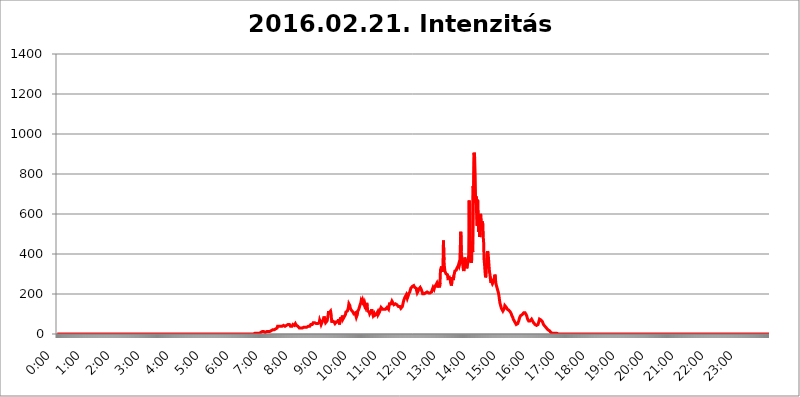
| Category | 2016.02.21. Intenzitás [W/m^2] |
|---|---|
| 0.0 | 0 |
| 0.0006944444444444445 | 0 |
| 0.001388888888888889 | 0 |
| 0.0020833333333333333 | 0 |
| 0.002777777777777778 | 0 |
| 0.003472222222222222 | 0 |
| 0.004166666666666667 | 0 |
| 0.004861111111111111 | 0 |
| 0.005555555555555556 | 0 |
| 0.0062499999999999995 | 0 |
| 0.006944444444444444 | 0 |
| 0.007638888888888889 | 0 |
| 0.008333333333333333 | 0 |
| 0.009027777777777779 | 0 |
| 0.009722222222222222 | 0 |
| 0.010416666666666666 | 0 |
| 0.011111111111111112 | 0 |
| 0.011805555555555555 | 0 |
| 0.012499999999999999 | 0 |
| 0.013194444444444444 | 0 |
| 0.013888888888888888 | 0 |
| 0.014583333333333332 | 0 |
| 0.015277777777777777 | 0 |
| 0.015972222222222224 | 0 |
| 0.016666666666666666 | 0 |
| 0.017361111111111112 | 0 |
| 0.018055555555555557 | 0 |
| 0.01875 | 0 |
| 0.019444444444444445 | 0 |
| 0.02013888888888889 | 0 |
| 0.020833333333333332 | 0 |
| 0.02152777777777778 | 0 |
| 0.022222222222222223 | 0 |
| 0.02291666666666667 | 0 |
| 0.02361111111111111 | 0 |
| 0.024305555555555556 | 0 |
| 0.024999999999999998 | 0 |
| 0.025694444444444447 | 0 |
| 0.02638888888888889 | 0 |
| 0.027083333333333334 | 0 |
| 0.027777777777777776 | 0 |
| 0.02847222222222222 | 0 |
| 0.029166666666666664 | 0 |
| 0.029861111111111113 | 0 |
| 0.030555555555555555 | 0 |
| 0.03125 | 0 |
| 0.03194444444444445 | 0 |
| 0.03263888888888889 | 0 |
| 0.03333333333333333 | 0 |
| 0.034027777777777775 | 0 |
| 0.034722222222222224 | 0 |
| 0.035416666666666666 | 0 |
| 0.036111111111111115 | 0 |
| 0.03680555555555556 | 0 |
| 0.0375 | 0 |
| 0.03819444444444444 | 0 |
| 0.03888888888888889 | 0 |
| 0.03958333333333333 | 0 |
| 0.04027777777777778 | 0 |
| 0.04097222222222222 | 0 |
| 0.041666666666666664 | 0 |
| 0.042361111111111106 | 0 |
| 0.04305555555555556 | 0 |
| 0.043750000000000004 | 0 |
| 0.044444444444444446 | 0 |
| 0.04513888888888889 | 0 |
| 0.04583333333333334 | 0 |
| 0.04652777777777778 | 0 |
| 0.04722222222222222 | 0 |
| 0.04791666666666666 | 0 |
| 0.04861111111111111 | 0 |
| 0.049305555555555554 | 0 |
| 0.049999999999999996 | 0 |
| 0.05069444444444445 | 0 |
| 0.051388888888888894 | 0 |
| 0.052083333333333336 | 0 |
| 0.05277777777777778 | 0 |
| 0.05347222222222222 | 0 |
| 0.05416666666666667 | 0 |
| 0.05486111111111111 | 0 |
| 0.05555555555555555 | 0 |
| 0.05625 | 0 |
| 0.05694444444444444 | 0 |
| 0.057638888888888885 | 0 |
| 0.05833333333333333 | 0 |
| 0.05902777777777778 | 0 |
| 0.059722222222222225 | 0 |
| 0.06041666666666667 | 0 |
| 0.061111111111111116 | 0 |
| 0.06180555555555556 | 0 |
| 0.0625 | 0 |
| 0.06319444444444444 | 0 |
| 0.06388888888888888 | 0 |
| 0.06458333333333334 | 0 |
| 0.06527777777777778 | 0 |
| 0.06597222222222222 | 0 |
| 0.06666666666666667 | 0 |
| 0.06736111111111111 | 0 |
| 0.06805555555555555 | 0 |
| 0.06874999999999999 | 0 |
| 0.06944444444444443 | 0 |
| 0.07013888888888889 | 0 |
| 0.07083333333333333 | 0 |
| 0.07152777777777779 | 0 |
| 0.07222222222222223 | 0 |
| 0.07291666666666667 | 0 |
| 0.07361111111111111 | 0 |
| 0.07430555555555556 | 0 |
| 0.075 | 0 |
| 0.07569444444444444 | 0 |
| 0.0763888888888889 | 0 |
| 0.07708333333333334 | 0 |
| 0.07777777777777778 | 0 |
| 0.07847222222222222 | 0 |
| 0.07916666666666666 | 0 |
| 0.0798611111111111 | 0 |
| 0.08055555555555556 | 0 |
| 0.08125 | 0 |
| 0.08194444444444444 | 0 |
| 0.08263888888888889 | 0 |
| 0.08333333333333333 | 0 |
| 0.08402777777777777 | 0 |
| 0.08472222222222221 | 0 |
| 0.08541666666666665 | 0 |
| 0.08611111111111112 | 0 |
| 0.08680555555555557 | 0 |
| 0.08750000000000001 | 0 |
| 0.08819444444444445 | 0 |
| 0.08888888888888889 | 0 |
| 0.08958333333333333 | 0 |
| 0.09027777777777778 | 0 |
| 0.09097222222222222 | 0 |
| 0.09166666666666667 | 0 |
| 0.09236111111111112 | 0 |
| 0.09305555555555556 | 0 |
| 0.09375 | 0 |
| 0.09444444444444444 | 0 |
| 0.09513888888888888 | 0 |
| 0.09583333333333333 | 0 |
| 0.09652777777777777 | 0 |
| 0.09722222222222222 | 0 |
| 0.09791666666666667 | 0 |
| 0.09861111111111111 | 0 |
| 0.09930555555555555 | 0 |
| 0.09999999999999999 | 0 |
| 0.10069444444444443 | 0 |
| 0.1013888888888889 | 0 |
| 0.10208333333333335 | 0 |
| 0.10277777777777779 | 0 |
| 0.10347222222222223 | 0 |
| 0.10416666666666667 | 0 |
| 0.10486111111111111 | 0 |
| 0.10555555555555556 | 0 |
| 0.10625 | 0 |
| 0.10694444444444444 | 0 |
| 0.1076388888888889 | 0 |
| 0.10833333333333334 | 0 |
| 0.10902777777777778 | 0 |
| 0.10972222222222222 | 0 |
| 0.1111111111111111 | 0 |
| 0.11180555555555556 | 0 |
| 0.11180555555555556 | 0 |
| 0.1125 | 0 |
| 0.11319444444444444 | 0 |
| 0.11388888888888889 | 0 |
| 0.11458333333333333 | 0 |
| 0.11527777777777777 | 0 |
| 0.11597222222222221 | 0 |
| 0.11666666666666665 | 0 |
| 0.1173611111111111 | 0 |
| 0.11805555555555557 | 0 |
| 0.11944444444444445 | 0 |
| 0.12013888888888889 | 0 |
| 0.12083333333333333 | 0 |
| 0.12152777777777778 | 0 |
| 0.12222222222222223 | 0 |
| 0.12291666666666667 | 0 |
| 0.12291666666666667 | 0 |
| 0.12361111111111112 | 0 |
| 0.12430555555555556 | 0 |
| 0.125 | 0 |
| 0.12569444444444444 | 0 |
| 0.12638888888888888 | 0 |
| 0.12708333333333333 | 0 |
| 0.16875 | 0 |
| 0.12847222222222224 | 0 |
| 0.12916666666666668 | 0 |
| 0.12986111111111112 | 0 |
| 0.13055555555555556 | 0 |
| 0.13125 | 0 |
| 0.13194444444444445 | 0 |
| 0.1326388888888889 | 0 |
| 0.13333333333333333 | 0 |
| 0.13402777777777777 | 0 |
| 0.13402777777777777 | 0 |
| 0.13472222222222222 | 0 |
| 0.13541666666666666 | 0 |
| 0.1361111111111111 | 0 |
| 0.13749999999999998 | 0 |
| 0.13819444444444443 | 0 |
| 0.1388888888888889 | 0 |
| 0.13958333333333334 | 0 |
| 0.14027777777777778 | 0 |
| 0.14097222222222222 | 0 |
| 0.14166666666666666 | 0 |
| 0.1423611111111111 | 0 |
| 0.14305555555555557 | 0 |
| 0.14375000000000002 | 0 |
| 0.14444444444444446 | 0 |
| 0.1451388888888889 | 0 |
| 0.1451388888888889 | 0 |
| 0.14652777777777778 | 0 |
| 0.14722222222222223 | 0 |
| 0.14791666666666667 | 0 |
| 0.1486111111111111 | 0 |
| 0.14930555555555555 | 0 |
| 0.15 | 0 |
| 0.15069444444444444 | 0 |
| 0.15138888888888888 | 0 |
| 0.15208333333333332 | 0 |
| 0.15277777777777776 | 0 |
| 0.15347222222222223 | 0 |
| 0.15416666666666667 | 0 |
| 0.15486111111111112 | 0 |
| 0.15555555555555556 | 0 |
| 0.15625 | 0 |
| 0.15694444444444444 | 0 |
| 0.15763888888888888 | 0 |
| 0.15833333333333333 | 0 |
| 0.15902777777777777 | 0 |
| 0.15972222222222224 | 0 |
| 0.16041666666666668 | 0 |
| 0.16111111111111112 | 0 |
| 0.16180555555555556 | 0 |
| 0.1625 | 0 |
| 0.16319444444444445 | 0 |
| 0.1638888888888889 | 0 |
| 0.16458333333333333 | 0 |
| 0.16527777777777777 | 0 |
| 0.16597222222222222 | 0 |
| 0.16666666666666666 | 0 |
| 0.1673611111111111 | 0 |
| 0.16805555555555554 | 0 |
| 0.16874999999999998 | 0 |
| 0.16944444444444443 | 0 |
| 0.17013888888888887 | 0 |
| 0.1708333333333333 | 0 |
| 0.17152777777777775 | 0 |
| 0.17222222222222225 | 0 |
| 0.1729166666666667 | 0 |
| 0.17361111111111113 | 0 |
| 0.17430555555555557 | 0 |
| 0.17500000000000002 | 0 |
| 0.17569444444444446 | 0 |
| 0.1763888888888889 | 0 |
| 0.17708333333333334 | 0 |
| 0.17777777777777778 | 0 |
| 0.17847222222222223 | 0 |
| 0.17916666666666667 | 0 |
| 0.1798611111111111 | 0 |
| 0.18055555555555555 | 0 |
| 0.18125 | 0 |
| 0.18194444444444444 | 0 |
| 0.1826388888888889 | 0 |
| 0.18333333333333335 | 0 |
| 0.1840277777777778 | 0 |
| 0.18472222222222223 | 0 |
| 0.18541666666666667 | 0 |
| 0.18611111111111112 | 0 |
| 0.18680555555555556 | 0 |
| 0.1875 | 0 |
| 0.18819444444444444 | 0 |
| 0.18888888888888888 | 0 |
| 0.18958333333333333 | 0 |
| 0.19027777777777777 | 0 |
| 0.1909722222222222 | 0 |
| 0.19166666666666665 | 0 |
| 0.19236111111111112 | 0 |
| 0.19305555555555554 | 0 |
| 0.19375 | 0 |
| 0.19444444444444445 | 0 |
| 0.1951388888888889 | 0 |
| 0.19583333333333333 | 0 |
| 0.19652777777777777 | 0 |
| 0.19722222222222222 | 0 |
| 0.19791666666666666 | 0 |
| 0.1986111111111111 | 0 |
| 0.19930555555555554 | 0 |
| 0.19999999999999998 | 0 |
| 0.20069444444444443 | 0 |
| 0.20138888888888887 | 0 |
| 0.2020833333333333 | 0 |
| 0.2027777777777778 | 0 |
| 0.2034722222222222 | 0 |
| 0.2041666666666667 | 0 |
| 0.20486111111111113 | 0 |
| 0.20555555555555557 | 0 |
| 0.20625000000000002 | 0 |
| 0.20694444444444446 | 0 |
| 0.2076388888888889 | 0 |
| 0.20833333333333334 | 0 |
| 0.20902777777777778 | 0 |
| 0.20972222222222223 | 0 |
| 0.21041666666666667 | 0 |
| 0.2111111111111111 | 0 |
| 0.21180555555555555 | 0 |
| 0.2125 | 0 |
| 0.21319444444444444 | 0 |
| 0.2138888888888889 | 0 |
| 0.21458333333333335 | 0 |
| 0.2152777777777778 | 0 |
| 0.21597222222222223 | 0 |
| 0.21666666666666667 | 0 |
| 0.21736111111111112 | 0 |
| 0.21805555555555556 | 0 |
| 0.21875 | 0 |
| 0.21944444444444444 | 0 |
| 0.22013888888888888 | 0 |
| 0.22083333333333333 | 0 |
| 0.22152777777777777 | 0 |
| 0.2222222222222222 | 0 |
| 0.22291666666666665 | 0 |
| 0.2236111111111111 | 0 |
| 0.22430555555555556 | 0 |
| 0.225 | 0 |
| 0.22569444444444445 | 0 |
| 0.2263888888888889 | 0 |
| 0.22708333333333333 | 0 |
| 0.22777777777777777 | 0 |
| 0.22847222222222222 | 0 |
| 0.22916666666666666 | 0 |
| 0.2298611111111111 | 0 |
| 0.23055555555555554 | 0 |
| 0.23124999999999998 | 0 |
| 0.23194444444444443 | 0 |
| 0.23263888888888887 | 0 |
| 0.2333333333333333 | 0 |
| 0.2340277777777778 | 0 |
| 0.2347222222222222 | 0 |
| 0.2354166666666667 | 0 |
| 0.23611111111111113 | 0 |
| 0.23680555555555557 | 0 |
| 0.23750000000000002 | 0 |
| 0.23819444444444446 | 0 |
| 0.2388888888888889 | 0 |
| 0.23958333333333334 | 0 |
| 0.24027777777777778 | 0 |
| 0.24097222222222223 | 0 |
| 0.24166666666666667 | 0 |
| 0.2423611111111111 | 0 |
| 0.24305555555555555 | 0 |
| 0.24375 | 0 |
| 0.24444444444444446 | 0 |
| 0.24513888888888888 | 0 |
| 0.24583333333333335 | 0 |
| 0.2465277777777778 | 0 |
| 0.24722222222222223 | 0 |
| 0.24791666666666667 | 0 |
| 0.24861111111111112 | 0 |
| 0.24930555555555556 | 0 |
| 0.25 | 0 |
| 0.25069444444444444 | 0 |
| 0.2513888888888889 | 0 |
| 0.2520833333333333 | 0 |
| 0.25277777777777777 | 0 |
| 0.2534722222222222 | 0 |
| 0.25416666666666665 | 0 |
| 0.2548611111111111 | 0 |
| 0.2555555555555556 | 0 |
| 0.25625000000000003 | 0 |
| 0.2569444444444445 | 0 |
| 0.2576388888888889 | 0 |
| 0.25833333333333336 | 0 |
| 0.2590277777777778 | 0 |
| 0.25972222222222224 | 0 |
| 0.2604166666666667 | 0 |
| 0.2611111111111111 | 0 |
| 0.26180555555555557 | 0 |
| 0.2625 | 0 |
| 0.26319444444444445 | 0 |
| 0.2638888888888889 | 0 |
| 0.26458333333333334 | 0 |
| 0.2652777777777778 | 0 |
| 0.2659722222222222 | 0 |
| 0.26666666666666666 | 0 |
| 0.2673611111111111 | 0 |
| 0.26805555555555555 | 0 |
| 0.26875 | 0 |
| 0.26944444444444443 | 0 |
| 0.2701388888888889 | 0 |
| 0.2708333333333333 | 0 |
| 0.27152777777777776 | 0 |
| 0.2722222222222222 | 0 |
| 0.27291666666666664 | 0 |
| 0.2736111111111111 | 0 |
| 0.2743055555555555 | 0 |
| 0.27499999999999997 | 0 |
| 0.27569444444444446 | 3.525 |
| 0.27638888888888885 | 3.525 |
| 0.27708333333333335 | 3.525 |
| 0.2777777777777778 | 3.525 |
| 0.27847222222222223 | 3.525 |
| 0.2791666666666667 | 3.525 |
| 0.2798611111111111 | 3.525 |
| 0.28055555555555556 | 3.525 |
| 0.28125 | 3.525 |
| 0.28194444444444444 | 3.525 |
| 0.2826388888888889 | 3.525 |
| 0.2833333333333333 | 3.525 |
| 0.28402777777777777 | 7.887 |
| 0.2847222222222222 | 7.887 |
| 0.28541666666666665 | 7.887 |
| 0.28611111111111115 | 7.887 |
| 0.28680555555555554 | 7.887 |
| 0.28750000000000003 | 12.257 |
| 0.2881944444444445 | 12.257 |
| 0.2888888888888889 | 12.257 |
| 0.28958333333333336 | 12.257 |
| 0.2902777777777778 | 12.257 |
| 0.29097222222222224 | 7.887 |
| 0.2916666666666667 | 7.887 |
| 0.2923611111111111 | 7.887 |
| 0.29305555555555557 | 7.887 |
| 0.29375 | 12.257 |
| 0.29444444444444445 | 12.257 |
| 0.2951388888888889 | 12.257 |
| 0.29583333333333334 | 12.257 |
| 0.2965277777777778 | 16.636 |
| 0.2972222222222222 | 16.636 |
| 0.29791666666666666 | 12.257 |
| 0.2986111111111111 | 12.257 |
| 0.29930555555555555 | 12.257 |
| 0.3 | 16.636 |
| 0.30069444444444443 | 16.636 |
| 0.3013888888888889 | 21.024 |
| 0.3020833333333333 | 21.024 |
| 0.30277777777777776 | 21.024 |
| 0.3034722222222222 | 21.024 |
| 0.30416666666666664 | 21.024 |
| 0.3048611111111111 | 25.419 |
| 0.3055555555555555 | 25.419 |
| 0.30624999999999997 | 25.419 |
| 0.3069444444444444 | 29.823 |
| 0.3076388888888889 | 29.823 |
| 0.30833333333333335 | 29.823 |
| 0.3090277777777778 | 38.653 |
| 0.30972222222222223 | 38.653 |
| 0.3104166666666667 | 38.653 |
| 0.3111111111111111 | 38.653 |
| 0.31180555555555556 | 43.079 |
| 0.3125 | 38.653 |
| 0.31319444444444444 | 38.653 |
| 0.3138888888888889 | 38.653 |
| 0.3145833333333333 | 38.653 |
| 0.31527777777777777 | 38.653 |
| 0.3159722222222222 | 43.079 |
| 0.31666666666666665 | 43.079 |
| 0.31736111111111115 | 43.079 |
| 0.31805555555555554 | 43.079 |
| 0.31875000000000003 | 38.653 |
| 0.3194444444444445 | 38.653 |
| 0.3201388888888889 | 43.079 |
| 0.32083333333333336 | 43.079 |
| 0.3215277777777778 | 43.079 |
| 0.32222222222222224 | 43.079 |
| 0.3229166666666667 | 43.079 |
| 0.3236111111111111 | 47.511 |
| 0.32430555555555557 | 47.511 |
| 0.325 | 51.951 |
| 0.32569444444444445 | 47.511 |
| 0.3263888888888889 | 43.079 |
| 0.32708333333333334 | 38.653 |
| 0.3277777777777778 | 43.079 |
| 0.3284722222222222 | 43.079 |
| 0.32916666666666666 | 38.653 |
| 0.3298611111111111 | 38.653 |
| 0.33055555555555555 | 47.511 |
| 0.33125 | 47.511 |
| 0.33194444444444443 | 47.511 |
| 0.3326388888888889 | 43.079 |
| 0.3333333333333333 | 47.511 |
| 0.3340277777777778 | 51.951 |
| 0.3347222222222222 | 51.951 |
| 0.3354166666666667 | 43.079 |
| 0.3361111111111111 | 47.511 |
| 0.3368055555555556 | 43.079 |
| 0.33749999999999997 | 38.653 |
| 0.33819444444444446 | 43.079 |
| 0.33888888888888885 | 38.653 |
| 0.33958333333333335 | 29.823 |
| 0.34027777777777773 | 29.823 |
| 0.34097222222222223 | 29.823 |
| 0.3416666666666666 | 29.823 |
| 0.3423611111111111 | 25.419 |
| 0.3430555555555555 | 29.823 |
| 0.34375 | 29.823 |
| 0.3444444444444445 | 29.823 |
| 0.3451388888888889 | 34.234 |
| 0.3458333333333334 | 34.234 |
| 0.34652777777777777 | 29.823 |
| 0.34722222222222227 | 29.823 |
| 0.34791666666666665 | 34.234 |
| 0.34861111111111115 | 38.653 |
| 0.34930555555555554 | 38.653 |
| 0.35000000000000003 | 34.234 |
| 0.3506944444444444 | 38.653 |
| 0.3513888888888889 | 34.234 |
| 0.3520833333333333 | 38.653 |
| 0.3527777777777778 | 43.079 |
| 0.3534722222222222 | 38.653 |
| 0.3541666666666667 | 38.653 |
| 0.3548611111111111 | 43.079 |
| 0.35555555555555557 | 47.511 |
| 0.35625 | 43.079 |
| 0.35694444444444445 | 47.511 |
| 0.3576388888888889 | 47.511 |
| 0.35833333333333334 | 47.511 |
| 0.3590277777777778 | 56.398 |
| 0.3597222222222222 | 56.398 |
| 0.36041666666666666 | 51.951 |
| 0.3611111111111111 | 56.398 |
| 0.36180555555555555 | 60.85 |
| 0.3625 | 51.951 |
| 0.36319444444444443 | 51.951 |
| 0.3638888888888889 | 51.951 |
| 0.3645833333333333 | 51.951 |
| 0.3652777777777778 | 51.951 |
| 0.3659722222222222 | 56.398 |
| 0.3666666666666667 | 56.398 |
| 0.3673611111111111 | 56.398 |
| 0.3680555555555556 | 69.775 |
| 0.36874999999999997 | 65.31 |
| 0.36944444444444446 | 56.398 |
| 0.37013888888888885 | 47.511 |
| 0.37083333333333335 | 51.951 |
| 0.37152777777777773 | 47.511 |
| 0.37222222222222223 | 65.31 |
| 0.3729166666666666 | 65.31 |
| 0.3736111111111111 | 78.722 |
| 0.3743055555555555 | 87.692 |
| 0.375 | 83.205 |
| 0.3756944444444445 | 65.31 |
| 0.3763888888888889 | 56.398 |
| 0.3770833333333334 | 60.85 |
| 0.37777777777777777 | 60.85 |
| 0.37847222222222227 | 65.31 |
| 0.37916666666666665 | 78.722 |
| 0.37986111111111115 | 92.184 |
| 0.38055555555555554 | 114.716 |
| 0.38125000000000003 | 105.69 |
| 0.3819444444444444 | 101.184 |
| 0.3826388888888889 | 110.201 |
| 0.3833333333333333 | 114.716 |
| 0.3840277777777778 | 101.184 |
| 0.3847222222222222 | 69.775 |
| 0.3854166666666667 | 56.398 |
| 0.3861111111111111 | 65.31 |
| 0.38680555555555557 | 60.85 |
| 0.3875 | 65.31 |
| 0.38819444444444445 | 60.85 |
| 0.3888888888888889 | 56.398 |
| 0.38958333333333334 | 51.951 |
| 0.3902777777777778 | 56.398 |
| 0.3909722222222222 | 56.398 |
| 0.39166666666666666 | 60.85 |
| 0.3923611111111111 | 65.31 |
| 0.39305555555555555 | 60.85 |
| 0.39375 | 60.85 |
| 0.39444444444444443 | 74.246 |
| 0.3951388888888889 | 60.85 |
| 0.3958333333333333 | 47.511 |
| 0.3965277777777778 | 65.31 |
| 0.3972222222222222 | 83.205 |
| 0.3979166666666667 | 74.246 |
| 0.3986111111111111 | 74.246 |
| 0.3993055555555556 | 83.205 |
| 0.39999999999999997 | 92.184 |
| 0.40069444444444446 | 74.246 |
| 0.40138888888888885 | 74.246 |
| 0.40208333333333335 | 83.205 |
| 0.40277777777777773 | 83.205 |
| 0.40347222222222223 | 87.692 |
| 0.4041666666666666 | 96.682 |
| 0.4048611111111111 | 110.201 |
| 0.4055555555555555 | 114.716 |
| 0.40625 | 114.716 |
| 0.4069444444444445 | 114.716 |
| 0.4076388888888889 | 114.716 |
| 0.4083333333333334 | 132.814 |
| 0.40902777777777777 | 150.964 |
| 0.40972222222222227 | 155.509 |
| 0.41041666666666665 | 141.884 |
| 0.41111111111111115 | 128.284 |
| 0.41180555555555554 | 123.758 |
| 0.41250000000000003 | 119.235 |
| 0.4131944444444444 | 123.758 |
| 0.4138888888888889 | 119.235 |
| 0.4145833333333333 | 110.201 |
| 0.4152777777777778 | 110.201 |
| 0.4159722222222222 | 101.184 |
| 0.4166666666666667 | 96.682 |
| 0.4173611111111111 | 105.69 |
| 0.41805555555555557 | 105.69 |
| 0.41875 | 92.184 |
| 0.41944444444444445 | 83.205 |
| 0.4201388888888889 | 87.692 |
| 0.42083333333333334 | 96.682 |
| 0.4215277777777778 | 114.716 |
| 0.4222222222222222 | 119.235 |
| 0.42291666666666666 | 123.758 |
| 0.4236111111111111 | 132.814 |
| 0.42430555555555555 | 132.814 |
| 0.425 | 137.347 |
| 0.42569444444444443 | 155.509 |
| 0.4263888888888889 | 169.156 |
| 0.4270833333333333 | 164.605 |
| 0.4277777777777778 | 160.056 |
| 0.4284722222222222 | 169.156 |
| 0.4291666666666667 | 169.156 |
| 0.4298611111111111 | 169.156 |
| 0.4305555555555556 | 146.423 |
| 0.43124999999999997 | 155.509 |
| 0.43194444444444446 | 160.056 |
| 0.43263888888888885 | 137.347 |
| 0.43333333333333335 | 132.814 |
| 0.43402777777777773 | 155.509 |
| 0.43472222222222223 | 141.884 |
| 0.4354166666666666 | 114.716 |
| 0.4361111111111111 | 110.201 |
| 0.4368055555555555 | 119.235 |
| 0.4375 | 110.201 |
| 0.4381944444444445 | 101.184 |
| 0.4388888888888889 | 101.184 |
| 0.4395833333333334 | 101.184 |
| 0.44027777777777777 | 114.716 |
| 0.44097222222222227 | 123.758 |
| 0.44166666666666665 | 110.201 |
| 0.44236111111111115 | 101.184 |
| 0.44305555555555554 | 92.184 |
| 0.44375000000000003 | 96.682 |
| 0.4444444444444444 | 101.184 |
| 0.4451388888888889 | 92.184 |
| 0.4458333333333333 | 87.692 |
| 0.4465277777777778 | 92.184 |
| 0.4472222222222222 | 96.682 |
| 0.4479166666666667 | 96.682 |
| 0.4486111111111111 | 96.682 |
| 0.44930555555555557 | 110.201 |
| 0.45 | 96.682 |
| 0.45069444444444445 | 92.184 |
| 0.4513888888888889 | 101.184 |
| 0.45208333333333334 | 110.201 |
| 0.4527777777777778 | 119.235 |
| 0.4534722222222222 | 123.758 |
| 0.45416666666666666 | 132.814 |
| 0.4548611111111111 | 137.347 |
| 0.45555555555555555 | 128.284 |
| 0.45625 | 123.758 |
| 0.45694444444444443 | 128.284 |
| 0.4576388888888889 | 128.284 |
| 0.4583333333333333 | 123.758 |
| 0.4590277777777778 | 123.758 |
| 0.4597222222222222 | 119.235 |
| 0.4604166666666667 | 123.758 |
| 0.4611111111111111 | 123.758 |
| 0.4618055555555556 | 128.284 |
| 0.46249999999999997 | 132.814 |
| 0.46319444444444446 | 137.347 |
| 0.46388888888888885 | 132.814 |
| 0.46458333333333335 | 123.758 |
| 0.46527777777777773 | 137.347 |
| 0.46597222222222223 | 150.964 |
| 0.4666666666666666 | 155.509 |
| 0.4673611111111111 | 155.509 |
| 0.4680555555555555 | 150.964 |
| 0.46875 | 155.509 |
| 0.4694444444444445 | 164.605 |
| 0.4701388888888889 | 164.605 |
| 0.4708333333333334 | 155.509 |
| 0.47152777777777777 | 150.964 |
| 0.47222222222222227 | 146.423 |
| 0.47291666666666665 | 150.964 |
| 0.47361111111111115 | 150.964 |
| 0.47430555555555554 | 150.964 |
| 0.47500000000000003 | 150.964 |
| 0.4756944444444444 | 146.423 |
| 0.4763888888888889 | 146.423 |
| 0.4770833333333333 | 141.884 |
| 0.4777777777777778 | 141.884 |
| 0.4784722222222222 | 137.347 |
| 0.4791666666666667 | 132.814 |
| 0.4798611111111111 | 132.814 |
| 0.48055555555555557 | 137.347 |
| 0.48125 | 137.347 |
| 0.48194444444444445 | 128.284 |
| 0.4826388888888889 | 128.284 |
| 0.48333333333333334 | 132.814 |
| 0.4840277777777778 | 137.347 |
| 0.4847222222222222 | 141.884 |
| 0.48541666666666666 | 160.056 |
| 0.4861111111111111 | 169.156 |
| 0.48680555555555555 | 169.156 |
| 0.4875 | 182.82 |
| 0.48819444444444443 | 187.378 |
| 0.4888888888888889 | 187.378 |
| 0.4895833333333333 | 196.497 |
| 0.4902777777777778 | 191.937 |
| 0.4909722222222222 | 178.264 |
| 0.4916666666666667 | 173.709 |
| 0.4923611111111111 | 191.937 |
| 0.4930555555555556 | 201.058 |
| 0.49374999999999997 | 201.058 |
| 0.49444444444444446 | 210.182 |
| 0.49513888888888885 | 219.309 |
| 0.49583333333333335 | 228.436 |
| 0.49652777777777773 | 233 |
| 0.49722222222222223 | 233 |
| 0.4979166666666666 | 237.564 |
| 0.4986111111111111 | 242.127 |
| 0.4993055555555555 | 242.127 |
| 0.5 | 242.127 |
| 0.5006944444444444 | 237.564 |
| 0.5013888888888889 | 233 |
| 0.5020833333333333 | 237.564 |
| 0.5027777777777778 | 237.564 |
| 0.5034722222222222 | 228.436 |
| 0.5041666666666667 | 214.746 |
| 0.5048611111111111 | 205.62 |
| 0.5055555555555555 | 205.62 |
| 0.50625 | 214.746 |
| 0.5069444444444444 | 223.873 |
| 0.5076388888888889 | 228.436 |
| 0.5083333333333333 | 228.436 |
| 0.5090277777777777 | 233 |
| 0.5097222222222222 | 228.436 |
| 0.5104166666666666 | 223.873 |
| 0.5111111111111112 | 219.309 |
| 0.5118055555555555 | 210.182 |
| 0.5125000000000001 | 201.058 |
| 0.5131944444444444 | 196.497 |
| 0.513888888888889 | 201.058 |
| 0.5145833333333333 | 201.058 |
| 0.5152777777777778 | 201.058 |
| 0.5159722222222222 | 205.62 |
| 0.5166666666666667 | 205.62 |
| 0.517361111111111 | 210.182 |
| 0.5180555555555556 | 205.62 |
| 0.5187499999999999 | 210.182 |
| 0.5194444444444445 | 205.62 |
| 0.5201388888888888 | 205.62 |
| 0.5208333333333334 | 205.62 |
| 0.5215277777777778 | 201.058 |
| 0.5222222222222223 | 201.058 |
| 0.5229166666666667 | 205.62 |
| 0.5236111111111111 | 205.62 |
| 0.5243055555555556 | 205.62 |
| 0.525 | 210.182 |
| 0.5256944444444445 | 219.309 |
| 0.5263888888888889 | 223.873 |
| 0.5270833333333333 | 233 |
| 0.5277777777777778 | 237.564 |
| 0.5284722222222222 | 223.873 |
| 0.5291666666666667 | 233 |
| 0.5298611111111111 | 233 |
| 0.5305555555555556 | 242.127 |
| 0.53125 | 246.689 |
| 0.5319444444444444 | 251.251 |
| 0.5326388888888889 | 233 |
| 0.5333333333333333 | 242.127 |
| 0.5340277777777778 | 251.251 |
| 0.5347222222222222 | 246.689 |
| 0.5354166666666667 | 242.127 |
| 0.5361111111111111 | 233 |
| 0.5368055555555555 | 255.813 |
| 0.5375 | 319.517 |
| 0.5381944444444444 | 324.052 |
| 0.5388888888888889 | 337.639 |
| 0.5395833333333333 | 310.44 |
| 0.5402777777777777 | 324.052 |
| 0.5409722222222222 | 333.113 |
| 0.5416666666666666 | 467.187 |
| 0.5423611111111112 | 369.23 |
| 0.5430555555555555 | 333.113 |
| 0.5437500000000001 | 314.98 |
| 0.5444444444444444 | 310.44 |
| 0.545138888888889 | 301.354 |
| 0.5458333333333333 | 301.354 |
| 0.5465277777777778 | 296.808 |
| 0.5472222222222222 | 296.808 |
| 0.5479166666666667 | 278.603 |
| 0.548611111111111 | 278.603 |
| 0.5493055555555556 | 283.156 |
| 0.5499999999999999 | 283.156 |
| 0.5506944444444445 | 274.047 |
| 0.5513888888888888 | 283.156 |
| 0.5520833333333334 | 255.813 |
| 0.5527777777777778 | 242.127 |
| 0.5534722222222223 | 260.373 |
| 0.5541666666666667 | 283.156 |
| 0.5548611111111111 | 283.156 |
| 0.5555555555555556 | 269.49 |
| 0.55625 | 292.259 |
| 0.5569444444444445 | 301.354 |
| 0.5576388888888889 | 314.98 |
| 0.5583333333333333 | 319.517 |
| 0.5590277777777778 | 319.517 |
| 0.5597222222222222 | 319.517 |
| 0.5604166666666667 | 328.584 |
| 0.5611111111111111 | 328.584 |
| 0.5618055555555556 | 333.113 |
| 0.5625 | 342.162 |
| 0.5631944444444444 | 351.198 |
| 0.5638888888888889 | 342.162 |
| 0.5645833333333333 | 351.198 |
| 0.5652777777777778 | 351.198 |
| 0.5659722222222222 | 510.885 |
| 0.5666666666666667 | 414.035 |
| 0.5673611111111111 | 382.715 |
| 0.5680555555555555 | 360.221 |
| 0.56875 | 346.682 |
| 0.5694444444444444 | 324.052 |
| 0.5701388888888889 | 314.98 |
| 0.5708333333333333 | 328.584 |
| 0.5715277777777777 | 382.715 |
| 0.5722222222222222 | 364.728 |
| 0.5729166666666666 | 373.729 |
| 0.5736111111111112 | 373.729 |
| 0.5743055555555555 | 328.584 |
| 0.5750000000000001 | 328.584 |
| 0.5756944444444444 | 355.712 |
| 0.576388888888889 | 369.23 |
| 0.5770833333333333 | 396.164 |
| 0.5777777777777778 | 667.123 |
| 0.5784722222222222 | 373.729 |
| 0.5791666666666667 | 360.221 |
| 0.579861111111111 | 373.729 |
| 0.5805555555555556 | 355.712 |
| 0.5812499999999999 | 369.23 |
| 0.5819444444444445 | 462.786 |
| 0.5826388888888888 | 409.574 |
| 0.5833333333333334 | 739.877 |
| 0.5840277777777778 | 719.877 |
| 0.5847222222222223 | 906.223 |
| 0.5854166666666667 | 883.516 |
| 0.5861111111111111 | 795.074 |
| 0.5868055555555556 | 654.791 |
| 0.5875 | 687.544 |
| 0.5881944444444445 | 604.864 |
| 0.5888888888888889 | 541.121 |
| 0.5895833333333333 | 671.22 |
| 0.5902777777777778 | 571.049 |
| 0.5909722222222222 | 510.885 |
| 0.5916666666666667 | 588.009 |
| 0.5923611111111111 | 484.735 |
| 0.5930555555555556 | 506.542 |
| 0.59375 | 600.661 |
| 0.5944444444444444 | 604.864 |
| 0.5951388888888889 | 519.555 |
| 0.5958333333333333 | 519.555 |
| 0.5965277777777778 | 562.53 |
| 0.5972222222222222 | 484.735 |
| 0.5979166666666667 | 471.582 |
| 0.5986111111111111 | 373.729 |
| 0.5993055555555555 | 346.682 |
| 0.6 | 310.44 |
| 0.6006944444444444 | 283.156 |
| 0.6013888888888889 | 292.259 |
| 0.6020833333333333 | 342.162 |
| 0.6027777777777777 | 396.164 |
| 0.6034722222222222 | 414.035 |
| 0.6041666666666666 | 405.108 |
| 0.6048611111111112 | 378.224 |
| 0.6055555555555555 | 342.162 |
| 0.6062500000000001 | 310.44 |
| 0.6069444444444444 | 296.808 |
| 0.607638888888889 | 269.49 |
| 0.6083333333333333 | 255.813 |
| 0.6090277777777778 | 264.932 |
| 0.6097222222222222 | 264.932 |
| 0.6104166666666667 | 251.251 |
| 0.611111111111111 | 251.251 |
| 0.6118055555555556 | 260.373 |
| 0.6124999999999999 | 274.047 |
| 0.6131944444444445 | 283.156 |
| 0.6138888888888888 | 296.808 |
| 0.6145833333333334 | 274.047 |
| 0.6152777777777778 | 251.251 |
| 0.6159722222222223 | 242.127 |
| 0.6166666666666667 | 237.564 |
| 0.6173611111111111 | 223.873 |
| 0.6180555555555556 | 214.746 |
| 0.61875 | 205.62 |
| 0.6194444444444445 | 191.937 |
| 0.6201388888888889 | 173.709 |
| 0.6208333333333333 | 155.509 |
| 0.6215277777777778 | 150.964 |
| 0.6222222222222222 | 137.347 |
| 0.6229166666666667 | 128.284 |
| 0.6236111111111111 | 123.758 |
| 0.6243055555555556 | 123.758 |
| 0.625 | 114.716 |
| 0.6256944444444444 | 114.716 |
| 0.6263888888888889 | 119.235 |
| 0.6270833333333333 | 128.284 |
| 0.6277777777777778 | 141.884 |
| 0.6284722222222222 | 146.423 |
| 0.6291666666666667 | 141.884 |
| 0.6298611111111111 | 132.814 |
| 0.6305555555555555 | 128.284 |
| 0.63125 | 123.758 |
| 0.6319444444444444 | 119.235 |
| 0.6326388888888889 | 119.235 |
| 0.6333333333333333 | 119.235 |
| 0.6340277777777777 | 119.235 |
| 0.6347222222222222 | 114.716 |
| 0.6354166666666666 | 110.201 |
| 0.6361111111111112 | 110.201 |
| 0.6368055555555555 | 101.184 |
| 0.6375000000000001 | 92.184 |
| 0.6381944444444444 | 87.692 |
| 0.638888888888889 | 83.205 |
| 0.6395833333333333 | 74.246 |
| 0.6402777777777778 | 69.775 |
| 0.6409722222222222 | 65.31 |
| 0.6416666666666667 | 60.85 |
| 0.642361111111111 | 56.398 |
| 0.6430555555555556 | 51.951 |
| 0.6437499999999999 | 47.511 |
| 0.6444444444444445 | 51.951 |
| 0.6451388888888888 | 51.951 |
| 0.6458333333333334 | 51.951 |
| 0.6465277777777778 | 56.398 |
| 0.6472222222222223 | 65.31 |
| 0.6479166666666667 | 74.246 |
| 0.6486111111111111 | 83.205 |
| 0.6493055555555556 | 87.692 |
| 0.65 | 92.184 |
| 0.6506944444444445 | 92.184 |
| 0.6513888888888889 | 96.682 |
| 0.6520833333333333 | 96.682 |
| 0.6527777777777778 | 101.184 |
| 0.6534722222222222 | 101.184 |
| 0.6541666666666667 | 105.69 |
| 0.6548611111111111 | 105.69 |
| 0.6555555555555556 | 105.69 |
| 0.65625 | 105.69 |
| 0.6569444444444444 | 105.69 |
| 0.6576388888888889 | 101.184 |
| 0.6583333333333333 | 92.184 |
| 0.6590277777777778 | 83.205 |
| 0.6597222222222222 | 74.246 |
| 0.6604166666666667 | 69.775 |
| 0.6611111111111111 | 65.31 |
| 0.6618055555555555 | 60.85 |
| 0.6625 | 60.85 |
| 0.6631944444444444 | 65.31 |
| 0.6638888888888889 | 65.31 |
| 0.6645833333333333 | 69.775 |
| 0.6652777777777777 | 74.246 |
| 0.6659722222222222 | 69.775 |
| 0.6666666666666666 | 65.31 |
| 0.6673611111111111 | 60.85 |
| 0.6680555555555556 | 56.398 |
| 0.6687500000000001 | 56.398 |
| 0.6694444444444444 | 56.398 |
| 0.6701388888888888 | 47.511 |
| 0.6708333333333334 | 47.511 |
| 0.6715277777777778 | 47.511 |
| 0.6722222222222222 | 43.079 |
| 0.6729166666666666 | 43.079 |
| 0.6736111111111112 | 43.079 |
| 0.6743055555555556 | 47.511 |
| 0.6749999999999999 | 56.398 |
| 0.6756944444444444 | 65.31 |
| 0.6763888888888889 | 74.246 |
| 0.6770833333333334 | 74.246 |
| 0.6777777777777777 | 74.246 |
| 0.6784722222222223 | 69.775 |
| 0.6791666666666667 | 69.775 |
| 0.6798611111111111 | 69.775 |
| 0.6805555555555555 | 60.85 |
| 0.68125 | 56.398 |
| 0.6819444444444445 | 47.511 |
| 0.6826388888888889 | 43.079 |
| 0.6833333333333332 | 43.079 |
| 0.6840277777777778 | 38.653 |
| 0.6847222222222222 | 38.653 |
| 0.6854166666666667 | 34.234 |
| 0.686111111111111 | 29.823 |
| 0.6868055555555556 | 25.419 |
| 0.6875 | 25.419 |
| 0.6881944444444444 | 21.024 |
| 0.688888888888889 | 21.024 |
| 0.6895833333333333 | 16.636 |
| 0.6902777777777778 | 16.636 |
| 0.6909722222222222 | 12.257 |
| 0.6916666666666668 | 12.257 |
| 0.6923611111111111 | 7.887 |
| 0.6930555555555555 | 7.887 |
| 0.69375 | 7.887 |
| 0.6944444444444445 | 3.525 |
| 0.6951388888888889 | 3.525 |
| 0.6958333333333333 | 3.525 |
| 0.6965277777777777 | 3.525 |
| 0.6972222222222223 | 3.525 |
| 0.6979166666666666 | 3.525 |
| 0.6986111111111111 | 3.525 |
| 0.6993055555555556 | 3.525 |
| 0.7000000000000001 | 3.525 |
| 0.7006944444444444 | 3.525 |
| 0.7013888888888888 | 3.525 |
| 0.7020833333333334 | 0 |
| 0.7027777777777778 | 0 |
| 0.7034722222222222 | 0 |
| 0.7041666666666666 | 0 |
| 0.7048611111111112 | 0 |
| 0.7055555555555556 | 0 |
| 0.7062499999999999 | 0 |
| 0.7069444444444444 | 0 |
| 0.7076388888888889 | 0 |
| 0.7083333333333334 | 0 |
| 0.7090277777777777 | 0 |
| 0.7097222222222223 | 0 |
| 0.7104166666666667 | 0 |
| 0.7111111111111111 | 0 |
| 0.7118055555555555 | 0 |
| 0.7125 | 0 |
| 0.7131944444444445 | 0 |
| 0.7138888888888889 | 0 |
| 0.7145833333333332 | 0 |
| 0.7152777777777778 | 0 |
| 0.7159722222222222 | 0 |
| 0.7166666666666667 | 0 |
| 0.717361111111111 | 0 |
| 0.7180555555555556 | 0 |
| 0.71875 | 0 |
| 0.7194444444444444 | 0 |
| 0.720138888888889 | 0 |
| 0.7208333333333333 | 0 |
| 0.7215277777777778 | 0 |
| 0.7222222222222222 | 0 |
| 0.7229166666666668 | 0 |
| 0.7236111111111111 | 0 |
| 0.7243055555555555 | 0 |
| 0.725 | 0 |
| 0.7256944444444445 | 0 |
| 0.7263888888888889 | 0 |
| 0.7270833333333333 | 0 |
| 0.7277777777777777 | 0 |
| 0.7284722222222223 | 0 |
| 0.7291666666666666 | 0 |
| 0.7298611111111111 | 0 |
| 0.7305555555555556 | 0 |
| 0.7312500000000001 | 0 |
| 0.7319444444444444 | 0 |
| 0.7326388888888888 | 0 |
| 0.7333333333333334 | 0 |
| 0.7340277777777778 | 0 |
| 0.7347222222222222 | 0 |
| 0.7354166666666666 | 0 |
| 0.7361111111111112 | 0 |
| 0.7368055555555556 | 0 |
| 0.7374999999999999 | 0 |
| 0.7381944444444444 | 0 |
| 0.7388888888888889 | 0 |
| 0.7395833333333334 | 0 |
| 0.7402777777777777 | 0 |
| 0.7409722222222223 | 0 |
| 0.7416666666666667 | 0 |
| 0.7423611111111111 | 0 |
| 0.7430555555555555 | 0 |
| 0.74375 | 0 |
| 0.7444444444444445 | 0 |
| 0.7451388888888889 | 0 |
| 0.7458333333333332 | 0 |
| 0.7465277777777778 | 0 |
| 0.7472222222222222 | 0 |
| 0.7479166666666667 | 0 |
| 0.748611111111111 | 0 |
| 0.7493055555555556 | 0 |
| 0.75 | 0 |
| 0.7506944444444444 | 0 |
| 0.751388888888889 | 0 |
| 0.7520833333333333 | 0 |
| 0.7527777777777778 | 0 |
| 0.7534722222222222 | 0 |
| 0.7541666666666668 | 0 |
| 0.7548611111111111 | 0 |
| 0.7555555555555555 | 0 |
| 0.75625 | 0 |
| 0.7569444444444445 | 0 |
| 0.7576388888888889 | 0 |
| 0.7583333333333333 | 0 |
| 0.7590277777777777 | 0 |
| 0.7597222222222223 | 0 |
| 0.7604166666666666 | 0 |
| 0.7611111111111111 | 0 |
| 0.7618055555555556 | 0 |
| 0.7625000000000001 | 0 |
| 0.7631944444444444 | 0 |
| 0.7638888888888888 | 0 |
| 0.7645833333333334 | 0 |
| 0.7652777777777778 | 0 |
| 0.7659722222222222 | 0 |
| 0.7666666666666666 | 0 |
| 0.7673611111111112 | 0 |
| 0.7680555555555556 | 0 |
| 0.7687499999999999 | 0 |
| 0.7694444444444444 | 0 |
| 0.7701388888888889 | 0 |
| 0.7708333333333334 | 0 |
| 0.7715277777777777 | 0 |
| 0.7722222222222223 | 0 |
| 0.7729166666666667 | 0 |
| 0.7736111111111111 | 0 |
| 0.7743055555555555 | 0 |
| 0.775 | 0 |
| 0.7756944444444445 | 0 |
| 0.7763888888888889 | 0 |
| 0.7770833333333332 | 0 |
| 0.7777777777777778 | 0 |
| 0.7784722222222222 | 0 |
| 0.7791666666666667 | 0 |
| 0.779861111111111 | 0 |
| 0.7805555555555556 | 0 |
| 0.78125 | 0 |
| 0.7819444444444444 | 0 |
| 0.782638888888889 | 0 |
| 0.7833333333333333 | 0 |
| 0.7840277777777778 | 0 |
| 0.7847222222222222 | 0 |
| 0.7854166666666668 | 0 |
| 0.7861111111111111 | 0 |
| 0.7868055555555555 | 0 |
| 0.7875 | 0 |
| 0.7881944444444445 | 0 |
| 0.7888888888888889 | 0 |
| 0.7895833333333333 | 0 |
| 0.7902777777777777 | 0 |
| 0.7909722222222223 | 0 |
| 0.7916666666666666 | 0 |
| 0.7923611111111111 | 0 |
| 0.7930555555555556 | 0 |
| 0.7937500000000001 | 0 |
| 0.7944444444444444 | 0 |
| 0.7951388888888888 | 0 |
| 0.7958333333333334 | 0 |
| 0.7965277777777778 | 0 |
| 0.7972222222222222 | 0 |
| 0.7979166666666666 | 0 |
| 0.7986111111111112 | 0 |
| 0.7993055555555556 | 0 |
| 0.7999999999999999 | 0 |
| 0.8006944444444444 | 0 |
| 0.8013888888888889 | 0 |
| 0.8020833333333334 | 0 |
| 0.8027777777777777 | 0 |
| 0.8034722222222223 | 0 |
| 0.8041666666666667 | 0 |
| 0.8048611111111111 | 0 |
| 0.8055555555555555 | 0 |
| 0.80625 | 0 |
| 0.8069444444444445 | 0 |
| 0.8076388888888889 | 0 |
| 0.8083333333333332 | 0 |
| 0.8090277777777778 | 0 |
| 0.8097222222222222 | 0 |
| 0.8104166666666667 | 0 |
| 0.811111111111111 | 0 |
| 0.8118055555555556 | 0 |
| 0.8125 | 0 |
| 0.8131944444444444 | 0 |
| 0.813888888888889 | 0 |
| 0.8145833333333333 | 0 |
| 0.8152777777777778 | 0 |
| 0.8159722222222222 | 0 |
| 0.8166666666666668 | 0 |
| 0.8173611111111111 | 0 |
| 0.8180555555555555 | 0 |
| 0.81875 | 0 |
| 0.8194444444444445 | 0 |
| 0.8201388888888889 | 0 |
| 0.8208333333333333 | 0 |
| 0.8215277777777777 | 0 |
| 0.8222222222222223 | 0 |
| 0.8229166666666666 | 0 |
| 0.8236111111111111 | 0 |
| 0.8243055555555556 | 0 |
| 0.8250000000000001 | 0 |
| 0.8256944444444444 | 0 |
| 0.8263888888888888 | 0 |
| 0.8270833333333334 | 0 |
| 0.8277777777777778 | 0 |
| 0.8284722222222222 | 0 |
| 0.8291666666666666 | 0 |
| 0.8298611111111112 | 0 |
| 0.8305555555555556 | 0 |
| 0.8312499999999999 | 0 |
| 0.8319444444444444 | 0 |
| 0.8326388888888889 | 0 |
| 0.8333333333333334 | 0 |
| 0.8340277777777777 | 0 |
| 0.8347222222222223 | 0 |
| 0.8354166666666667 | 0 |
| 0.8361111111111111 | 0 |
| 0.8368055555555555 | 0 |
| 0.8375 | 0 |
| 0.8381944444444445 | 0 |
| 0.8388888888888889 | 0 |
| 0.8395833333333332 | 0 |
| 0.8402777777777778 | 0 |
| 0.8409722222222222 | 0 |
| 0.8416666666666667 | 0 |
| 0.842361111111111 | 0 |
| 0.8430555555555556 | 0 |
| 0.84375 | 0 |
| 0.8444444444444444 | 0 |
| 0.845138888888889 | 0 |
| 0.8458333333333333 | 0 |
| 0.8465277777777778 | 0 |
| 0.8472222222222222 | 0 |
| 0.8479166666666668 | 0 |
| 0.8486111111111111 | 0 |
| 0.8493055555555555 | 0 |
| 0.85 | 0 |
| 0.8506944444444445 | 0 |
| 0.8513888888888889 | 0 |
| 0.8520833333333333 | 0 |
| 0.8527777777777777 | 0 |
| 0.8534722222222223 | 0 |
| 0.8541666666666666 | 0 |
| 0.8548611111111111 | 0 |
| 0.8555555555555556 | 0 |
| 0.8562500000000001 | 0 |
| 0.8569444444444444 | 0 |
| 0.8576388888888888 | 0 |
| 0.8583333333333334 | 0 |
| 0.8590277777777778 | 0 |
| 0.8597222222222222 | 0 |
| 0.8604166666666666 | 0 |
| 0.8611111111111112 | 0 |
| 0.8618055555555556 | 0 |
| 0.8624999999999999 | 0 |
| 0.8631944444444444 | 0 |
| 0.8638888888888889 | 0 |
| 0.8645833333333334 | 0 |
| 0.8652777777777777 | 0 |
| 0.8659722222222223 | 0 |
| 0.8666666666666667 | 0 |
| 0.8673611111111111 | 0 |
| 0.8680555555555555 | 0 |
| 0.86875 | 0 |
| 0.8694444444444445 | 0 |
| 0.8701388888888889 | 0 |
| 0.8708333333333332 | 0 |
| 0.8715277777777778 | 0 |
| 0.8722222222222222 | 0 |
| 0.8729166666666667 | 0 |
| 0.873611111111111 | 0 |
| 0.8743055555555556 | 0 |
| 0.875 | 0 |
| 0.8756944444444444 | 0 |
| 0.876388888888889 | 0 |
| 0.8770833333333333 | 0 |
| 0.8777777777777778 | 0 |
| 0.8784722222222222 | 0 |
| 0.8791666666666668 | 0 |
| 0.8798611111111111 | 0 |
| 0.8805555555555555 | 0 |
| 0.88125 | 0 |
| 0.8819444444444445 | 0 |
| 0.8826388888888889 | 0 |
| 0.8833333333333333 | 0 |
| 0.8840277777777777 | 0 |
| 0.8847222222222223 | 0 |
| 0.8854166666666666 | 0 |
| 0.8861111111111111 | 0 |
| 0.8868055555555556 | 0 |
| 0.8875000000000001 | 0 |
| 0.8881944444444444 | 0 |
| 0.8888888888888888 | 0 |
| 0.8895833333333334 | 0 |
| 0.8902777777777778 | 0 |
| 0.8909722222222222 | 0 |
| 0.8916666666666666 | 0 |
| 0.8923611111111112 | 0 |
| 0.8930555555555556 | 0 |
| 0.8937499999999999 | 0 |
| 0.8944444444444444 | 0 |
| 0.8951388888888889 | 0 |
| 0.8958333333333334 | 0 |
| 0.8965277777777777 | 0 |
| 0.8972222222222223 | 0 |
| 0.8979166666666667 | 0 |
| 0.8986111111111111 | 0 |
| 0.8993055555555555 | 0 |
| 0.9 | 0 |
| 0.9006944444444445 | 0 |
| 0.9013888888888889 | 0 |
| 0.9020833333333332 | 0 |
| 0.9027777777777778 | 0 |
| 0.9034722222222222 | 0 |
| 0.9041666666666667 | 0 |
| 0.904861111111111 | 0 |
| 0.9055555555555556 | 0 |
| 0.90625 | 0 |
| 0.9069444444444444 | 0 |
| 0.907638888888889 | 0 |
| 0.9083333333333333 | 0 |
| 0.9090277777777778 | 0 |
| 0.9097222222222222 | 0 |
| 0.9104166666666668 | 0 |
| 0.9111111111111111 | 0 |
| 0.9118055555555555 | 0 |
| 0.9125 | 0 |
| 0.9131944444444445 | 0 |
| 0.9138888888888889 | 0 |
| 0.9145833333333333 | 0 |
| 0.9152777777777777 | 0 |
| 0.9159722222222223 | 0 |
| 0.9166666666666666 | 0 |
| 0.9173611111111111 | 0 |
| 0.9180555555555556 | 0 |
| 0.9187500000000001 | 0 |
| 0.9194444444444444 | 0 |
| 0.9201388888888888 | 0 |
| 0.9208333333333334 | 0 |
| 0.9215277777777778 | 0 |
| 0.9222222222222222 | 0 |
| 0.9229166666666666 | 0 |
| 0.9236111111111112 | 0 |
| 0.9243055555555556 | 0 |
| 0.9249999999999999 | 0 |
| 0.9256944444444444 | 0 |
| 0.9263888888888889 | 0 |
| 0.9270833333333334 | 0 |
| 0.9277777777777777 | 0 |
| 0.9284722222222223 | 0 |
| 0.9291666666666667 | 0 |
| 0.9298611111111111 | 0 |
| 0.9305555555555555 | 0 |
| 0.93125 | 0 |
| 0.9319444444444445 | 0 |
| 0.9326388888888889 | 0 |
| 0.9333333333333332 | 0 |
| 0.9340277777777778 | 0 |
| 0.9347222222222222 | 0 |
| 0.9354166666666667 | 0 |
| 0.936111111111111 | 0 |
| 0.9368055555555556 | 0 |
| 0.9375 | 0 |
| 0.9381944444444444 | 0 |
| 0.938888888888889 | 0 |
| 0.9395833333333333 | 0 |
| 0.9402777777777778 | 0 |
| 0.9409722222222222 | 0 |
| 0.9416666666666668 | 0 |
| 0.9423611111111111 | 0 |
| 0.9430555555555555 | 0 |
| 0.94375 | 0 |
| 0.9444444444444445 | 0 |
| 0.9451388888888889 | 0 |
| 0.9458333333333333 | 0 |
| 0.9465277777777777 | 0 |
| 0.9472222222222223 | 0 |
| 0.9479166666666666 | 0 |
| 0.9486111111111111 | 0 |
| 0.9493055555555556 | 0 |
| 0.9500000000000001 | 0 |
| 0.9506944444444444 | 0 |
| 0.9513888888888888 | 0 |
| 0.9520833333333334 | 0 |
| 0.9527777777777778 | 0 |
| 0.9534722222222222 | 0 |
| 0.9541666666666666 | 0 |
| 0.9548611111111112 | 0 |
| 0.9555555555555556 | 0 |
| 0.9562499999999999 | 0 |
| 0.9569444444444444 | 0 |
| 0.9576388888888889 | 0 |
| 0.9583333333333334 | 0 |
| 0.9590277777777777 | 0 |
| 0.9597222222222223 | 0 |
| 0.9604166666666667 | 0 |
| 0.9611111111111111 | 0 |
| 0.9618055555555555 | 0 |
| 0.9625 | 0 |
| 0.9631944444444445 | 0 |
| 0.9638888888888889 | 0 |
| 0.9645833333333332 | 0 |
| 0.9652777777777778 | 0 |
| 0.9659722222222222 | 0 |
| 0.9666666666666667 | 0 |
| 0.967361111111111 | 0 |
| 0.9680555555555556 | 0 |
| 0.96875 | 0 |
| 0.9694444444444444 | 0 |
| 0.970138888888889 | 0 |
| 0.9708333333333333 | 0 |
| 0.9715277777777778 | 0 |
| 0.9722222222222222 | 0 |
| 0.9729166666666668 | 0 |
| 0.9736111111111111 | 0 |
| 0.9743055555555555 | 0 |
| 0.975 | 0 |
| 0.9756944444444445 | 0 |
| 0.9763888888888889 | 0 |
| 0.9770833333333333 | 0 |
| 0.9777777777777777 | 0 |
| 0.9784722222222223 | 0 |
| 0.9791666666666666 | 0 |
| 0.9798611111111111 | 0 |
| 0.9805555555555556 | 0 |
| 0.9812500000000001 | 0 |
| 0.9819444444444444 | 0 |
| 0.9826388888888888 | 0 |
| 0.9833333333333334 | 0 |
| 0.9840277777777778 | 0 |
| 0.9847222222222222 | 0 |
| 0.9854166666666666 | 0 |
| 0.9861111111111112 | 0 |
| 0.9868055555555556 | 0 |
| 0.9874999999999999 | 0 |
| 0.9881944444444444 | 0 |
| 0.9888888888888889 | 0 |
| 0.9895833333333334 | 0 |
| 0.9902777777777777 | 0 |
| 0.9909722222222223 | 0 |
| 0.9916666666666667 | 0 |
| 0.9923611111111111 | 0 |
| 0.9930555555555555 | 0 |
| 0.99375 | 0 |
| 0.9944444444444445 | 0 |
| 0.9951388888888889 | 0 |
| 0.9958333333333332 | 0 |
| 0.9965277777777778 | 0 |
| 0.9972222222222222 | 0 |
| 0.9979166666666667 | 0 |
| 0.998611111111111 | 0 |
| 0.9993055555555556 | 0 |